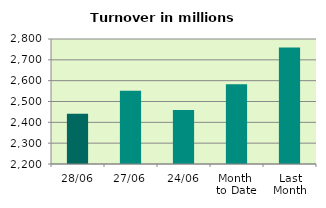
| Category | Series 0 |
|---|---|
| 28/06 | 2441.136 |
| 27/06 | 2552.177 |
| 24/06 | 2459.017 |
| Month 
to Date | 2582.275 |
| Last
Month | 2758.944 |